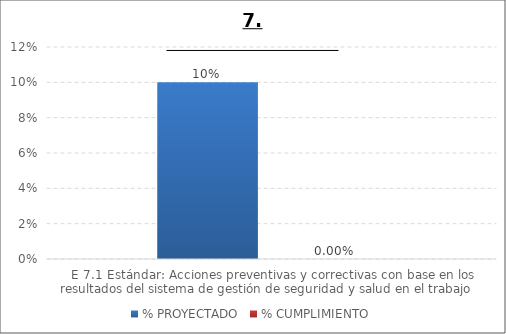
| Category | % PROYECTADO | % CUMPLIMIENTO |
|---|---|---|
| E 7.1 Estándar: Acciones preventivas y correctivas con base en los resultados del sistema de gestión de seguridad y salud en el trabajo    | 0.1 | 0 |